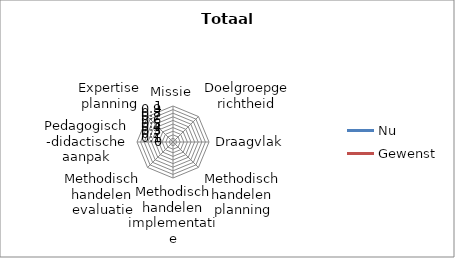
| Category | Nu | Gewenst |
|---|---|---|
| Missie | 0 | 0 |
| Doelgroepgerichtheid | 0 | 0 |
| Draagvlak | 0 | 0 |
| Methodisch handelen planning | 0 | 0 |
| Methodisch handelen implementatie | 0 | 0 |
| Methodisch handelen evaluatie | 0 | 0 |
| Pedagogisch-didactische aanpak | 0 | 0 |
| Expertise planning | 0 | 0 |